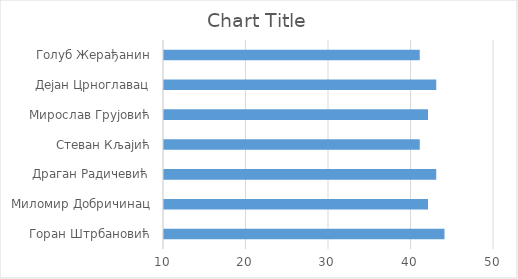
| Category | Series 0 |
|---|---|
| Горан Штрбановић | 44 |
| Миломир Добричинац | 42 |
| Драган Радичевић | 43 |
| Стеван Кљајић | 41 |
| Мирослав Грујовић | 42 |
| Дејан Црноглавац | 43 |
| Голуб Жерађанин | 41 |